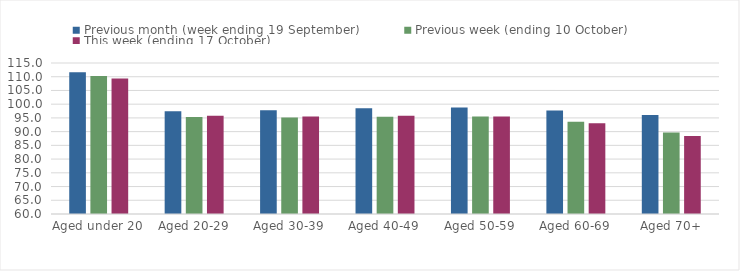
| Category | Previous month (week ending 19 September) | Previous week (ending 10 October) | This week (ending 17 October) |
|---|---|---|---|
| Aged under 20 | 111.59 | 110.22 | 109.32 |
| Aged 20-29 | 97.42 | 95.32 | 95.79 |
| Aged 30-39 | 97.76 | 95.14 | 95.48 |
| Aged 40-49 | 98.56 | 95.43 | 95.76 |
| Aged 50-59 | 98.8 | 95.49 | 95.52 |
| Aged 60-69 | 97.69 | 93.57 | 93.03 |
| Aged 70+ | 96.06 | 89.71 | 88.41 |